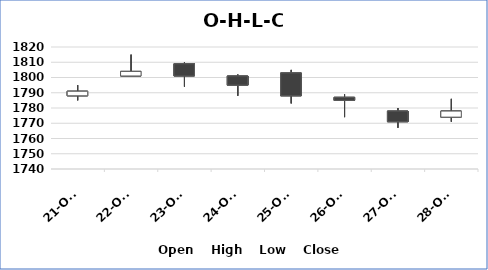
| Category | Open | High | Low | Close |
|---|---|---|---|---|
| 2021-10-21 | 1788 | 1795 | 1785 | 1791 |
| 2021-10-22 | 1801 | 1815 | 1801 | 1804 |
| 2021-10-23 | 1809 | 1810 | 1794 | 1801 |
| 2021-10-24 | 1801 | 1802 | 1788 | 1795 |
| 2021-10-25 | 1803 | 1805 | 1783 | 1788 |
| 2021-10-26 | 1787 | 1789 | 1774 | 1785 |
| 2021-10-27 | 1778 | 1780 | 1767 | 1771 |
| 2021-10-28 | 1774 | 1786 | 1771 | 1778 |